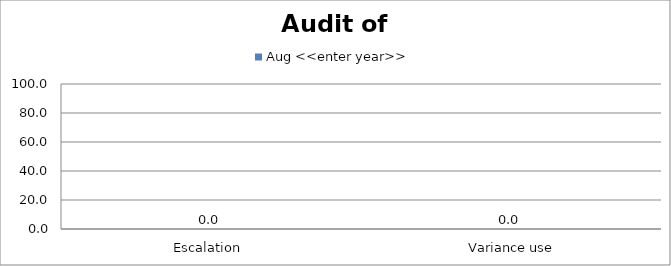
| Category | Aug <<enter year>> |
|---|---|
| Escalation  | 0 |
|  Variance use | 0 |